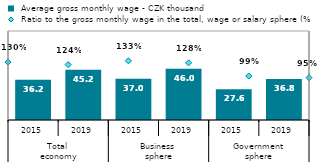
| Category |  Average gross monthly wage - CZK thousand |
|---|---|
| 0 | 36.187 |
| 1 | 45.219 |
| 2 | 36.984 |
| 3 | 45.999 |
| 4 | 27.59 |
| 5 | 36.802 |